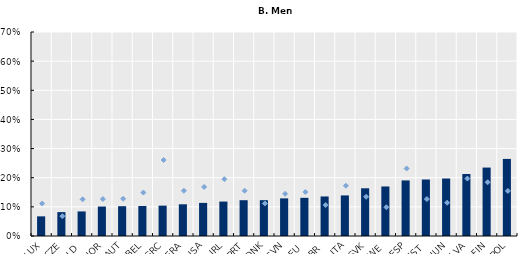
| Category | Mid-1990s |
|---|---|
| LUX | 0.067 |
| CZE | 0.082 |
| NLD | 0.084 |
| NOR | 0.101 |
| AUT | 0.102 |
| BEL | 0.103 |
| GRC | 0.104 |
| FRA | 0.109 |
| USA | 0.114 |
| IRL | 0.118 |
| PRT | 0.123 |
| DNK | 0.123 |
| SVN | 0.129 |
| DEU | 0.131 |
| GBR | 0.136 |
| ITA | 0.139 |
| SVK | 0.164 |
| SWE | 0.17 |
| ESP | 0.191 |
| EST | 0.194 |
| HUN | 0.197 |
| LVA | 0.213 |
| FIN | 0.235 |
| POL | 0.264 |